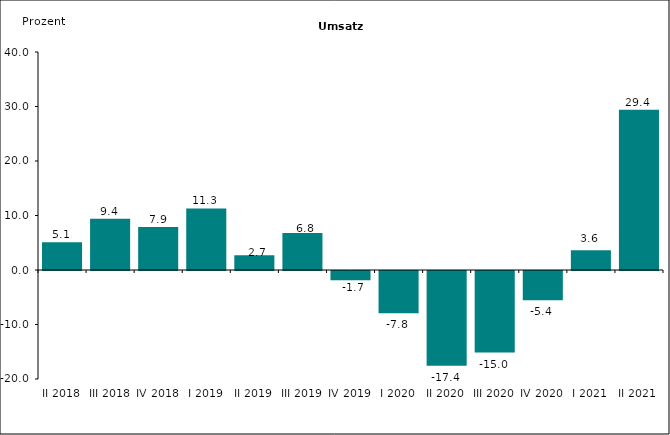
| Category | 5,1 |
|---|---|
| II 2018 | 5.1 |
| III 2018 | 9.4 |
| IV 2018 | 7.9 |
| I 2019 | 11.3 |
| II 2019 | 2.702 |
| III 2019 | 6.777 |
| IV 2019 | -1.702 |
| I 2020 | -7.775 |
| II 2020 | -17.405 |
| III 2020 | -14.955 |
| IV 2020 | -5.368 |
| I 2021 | 3.627 |
| II 2021 | 29.396 |